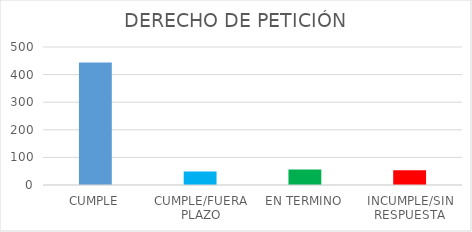
| Category | TOTAL |
|---|---|
| CUMPLE | 444 |
| CUMPLE/FUERA PLAZO | 49 |
| EN TERMINO | 56 |
| INCUMPLE/SIN RESPUESTA | 53 |